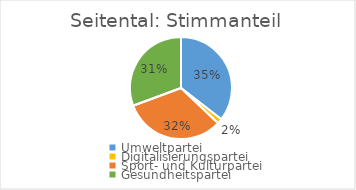
| Category | Stimmanteil |
|---|---|
| Umweltpartei | 0.355 |
| Digitalisierungspartei | 0.016 |
| Sport- und Kulturpartei | 0.323 |
| Gesundheitspartei | 0.306 |